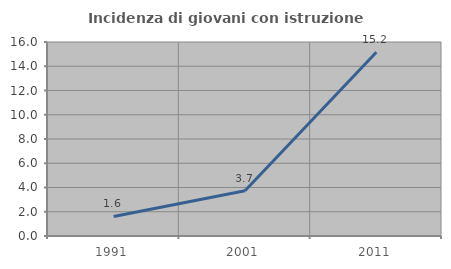
| Category | Incidenza di giovani con istruzione universitaria |
|---|---|
| 1991.0 | 1.613 |
| 2001.0 | 3.738 |
| 2011.0 | 15.152 |